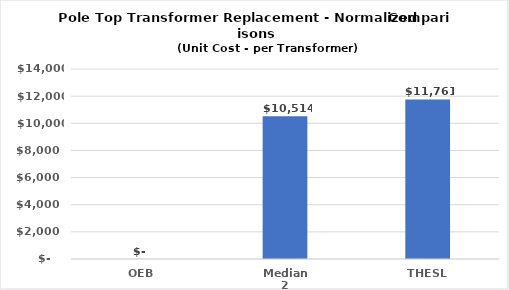
| Category | Series 0 |
|---|---|
| OEB | 0 |
| Median 2 | 10514.395 |
| THESL | 11761 |